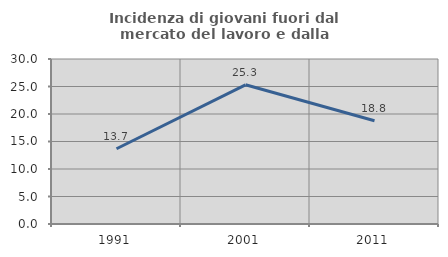
| Category | Incidenza di giovani fuori dal mercato del lavoro e dalla formazione  |
|---|---|
| 1991.0 | 13.676 |
| 2001.0 | 25.309 |
| 2011.0 | 18.778 |